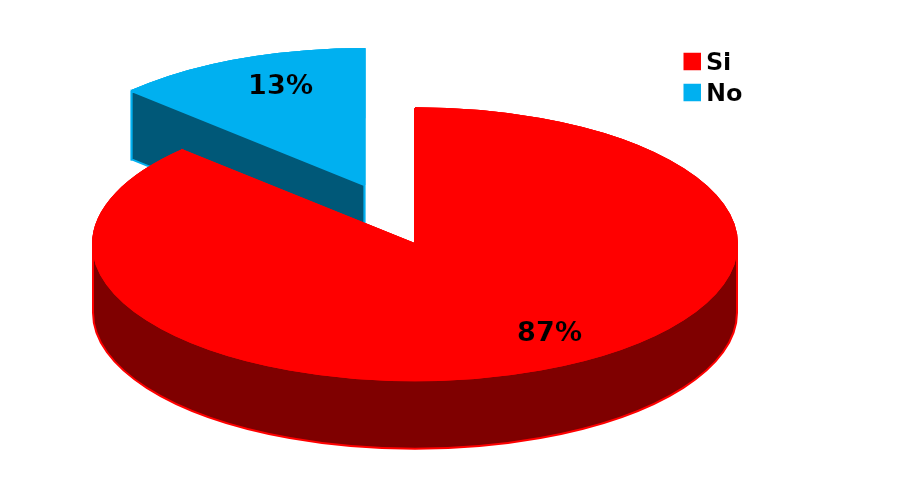
| Category | Series 0 |
|---|---|
| Si | 122 |
| No | 18 |